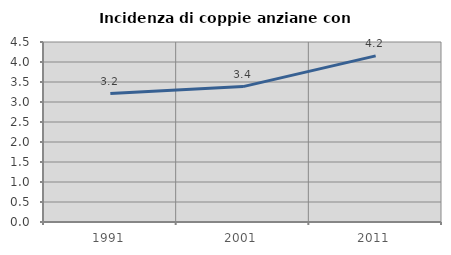
| Category | Incidenza di coppie anziane con figli |
|---|---|
| 1991.0 | 3.21 |
| 2001.0 | 3.385 |
| 2011.0 | 4.154 |